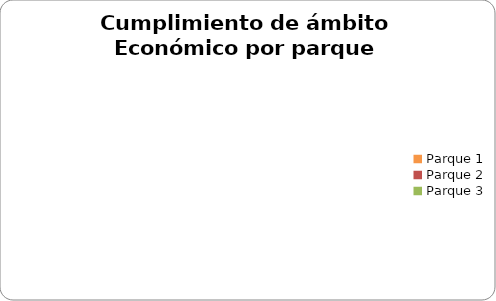
| Category | Económico |
|---|---|
| Parque 1 | 0 |
| Parque 2 | 0 |
| Parque 3 | 0 |